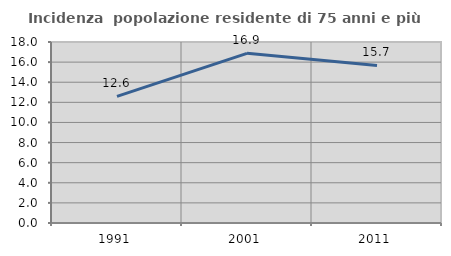
| Category | Incidenza  popolazione residente di 75 anni e più |
|---|---|
| 1991.0 | 12.585 |
| 2001.0 | 16.876 |
| 2011.0 | 15.665 |